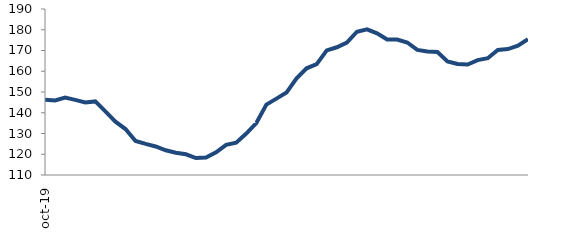
| Category | Series 1 |
|---|---|
| 2019-10-01 | 146.216 |
| 2019-11-01 | 145.952 |
| 2019-12-01 | 147.284 |
| 2020-01-01 | 146.194 |
| 2020-02-01 | 144.98 |
| 2020-03-01 | 145.471 |
| 2020-04-01 | 140.66 |
| 2020-05-01 | 135.678 |
| 2020-06-01 | 132.14 |
| 2020-07-01 | 126.404 |
| 2020-08-01 | 124.978 |
| 2020-09-01 | 123.76 |
| 2020-10-01 | 121.904 |
| 2020-11-01 | 120.729 |
| 2020-12-01 | 119.982 |
| 2021-01-01 | 118.16 |
| 2021-02-01 | 118.385 |
| 2021-03-01 | 120.897 |
| 2021-04-01 | 124.521 |
| 2021-05-01 | 125.561 |
| 2021-06-01 | 129.991 |
| 2021-07-01 | 135.036 |
| 2021-08-01 | 143.93 |
| 2021-09-01 | 146.816 |
| 2021-10-01 | 149.733 |
| 2021-11-01 | 156.598 |
| 2021-12-01 | 161.424 |
| 2022-01-01 | 163.409 |
| 2022-02-01 | 170.051 |
| 2022-03-01 | 171.561 |
| 2022-04-01 | 173.768 |
| 2022-05-01 | 179.049 |
| 2022-06-01 | 180.219 |
| 2022-07-01 | 178.235 |
| 2022-08-01 | 175.283 |
| 2022-09-01 | 175.244 |
| 2022-10-01 | 173.855 |
| 2022-11-01 | 170.303 |
| 2022-12-01 | 169.507 |
| 2023-01-01 | 169.264 |
| 2023-02-01 | 164.751 |
| 2023-03-01 | 163.49 |
| 2023-04-01 | 163.213 |
| 2023-05-01 | 165.362 |
| 2023-06-01 | 166.293 |
| 2023-07-01 | 170.283 |
| 2023-08-01 | 170.701 |
| 2023-09-01 | 172.319 |
| 2023-10-01 | 175.469 |